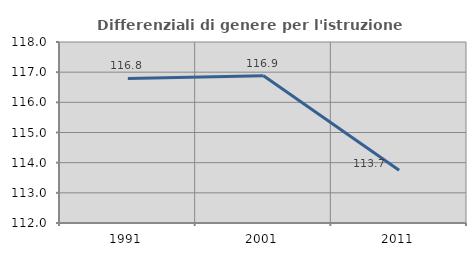
| Category | Differenziali di genere per l'istruzione superiore |
|---|---|
| 1991.0 | 116.794 |
| 2001.0 | 116.884 |
| 2011.0 | 113.746 |